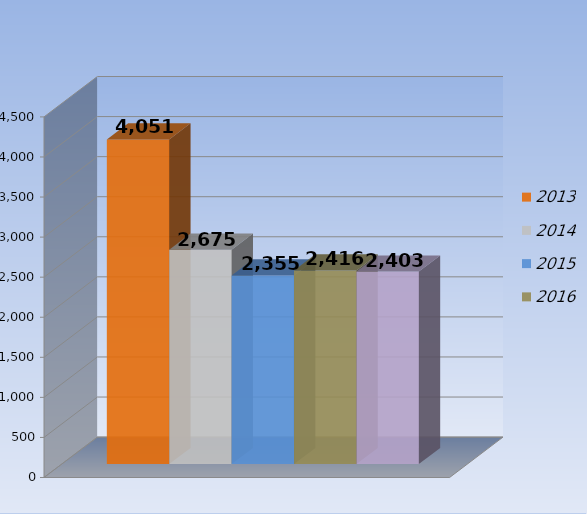
| Category | 2013 | 2014 | 2015 | 2016 | 2017 |
|---|---|---|---|---|---|
| 0 | 4051 | 2675 | 2355 | 2416 | 2403 |